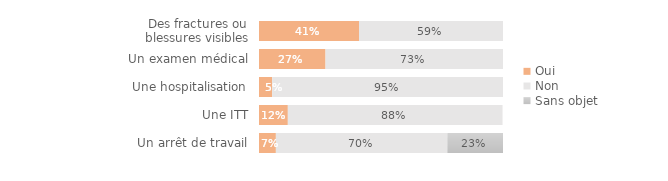
| Category | Oui | Non | Sans objet | Ne sait pas/Refus |
|---|---|---|---|---|
| Des fractures ou blessures visibles | 0.41 | 0.59 | 0 | 0 |
| Un examen médical | 0.273 | 0.727 | 0 | 0 |
| Une hospitalisation | 0.054 | 0.946 | 0 | 0 |
| Une ITT | 0.118 | 0.88 | 0 | 0 |
| Un arrêt de travail | 0.069 | 0.703 | 0.228 | 0 |